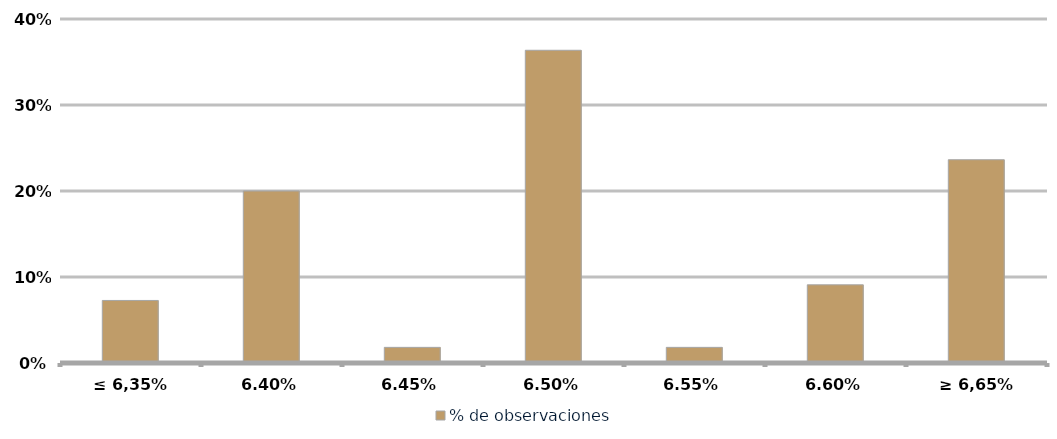
| Category | % de observaciones  |
|---|---|
| ≤ 6,35% | 0.073 |
| 6,40% | 0.2 |
| 6,45% | 0.018 |
| 6,50% | 0.364 |
| 6,55% | 0.018 |
| 6,60% | 0.091 |
| ≥ 6,65% | 0.236 |